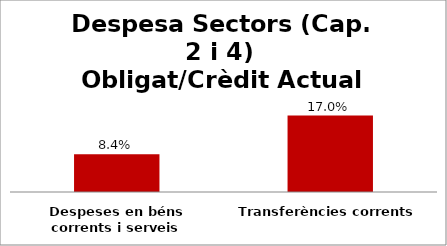
| Category | Series 0 |
|---|---|
| Despeses en béns corrents i serveis | 0.084 |
| Transferències corrents | 0.17 |